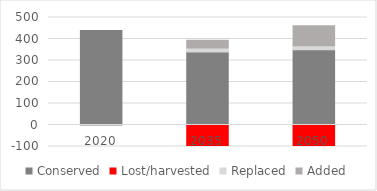
| Category | Conserved | Lost/harvested | Replaced | Added |
|---|---|---|---|---|
| 2020.0 | 440 | 0 | 0 | 0 |
| 2035.0 | 339.9 | -113.3 | 18.025 | 36.05 |
| 2050.0 | 350.097 | -116.699 | 18.566 | 92.829 |